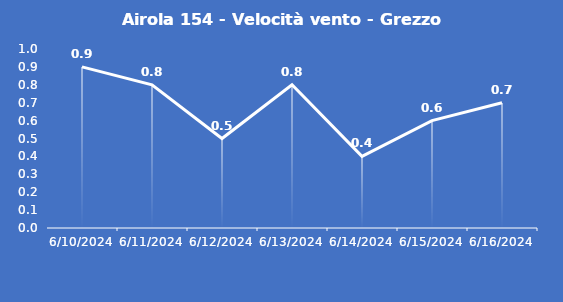
| Category | Airola 154 - Velocità vento - Grezzo (m/s) |
|---|---|
| 6/10/24 | 0.9 |
| 6/11/24 | 0.8 |
| 6/12/24 | 0.5 |
| 6/13/24 | 0.8 |
| 6/14/24 | 0.4 |
| 6/15/24 | 0.6 |
| 6/16/24 | 0.7 |